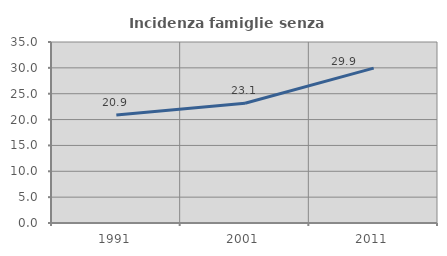
| Category | Incidenza famiglie senza nuclei |
|---|---|
| 1991.0 | 20.875 |
| 2001.0 | 23.145 |
| 2011.0 | 29.941 |